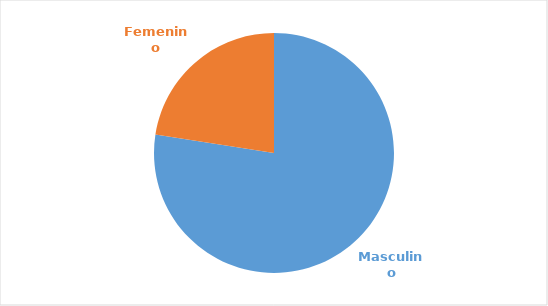
| Category | Series 0 |
|---|---|
| Masculino | 0.775 |
| Femenino | 0.225 |